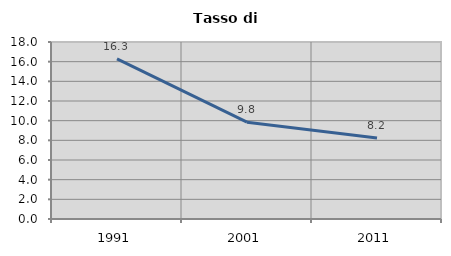
| Category | Tasso di disoccupazione   |
|---|---|
| 1991.0 | 16.287 |
| 2001.0 | 9.848 |
| 2011.0 | 8.228 |